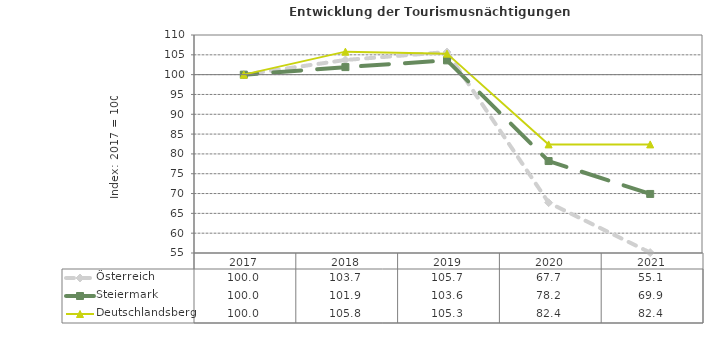
| Category | Österreich | Steiermark | Deutschlandsberg |
|---|---|---|---|
| 2021.0 | 55.1 | 69.9 | 82.4 |
| 2020.0 | 67.7 | 78.2 | 82.4 |
| 2019.0 | 105.7 | 103.6 | 105.3 |
| 2018.0 | 103.7 | 101.9 | 105.8 |
| 2017.0 | 100 | 100 | 100 |